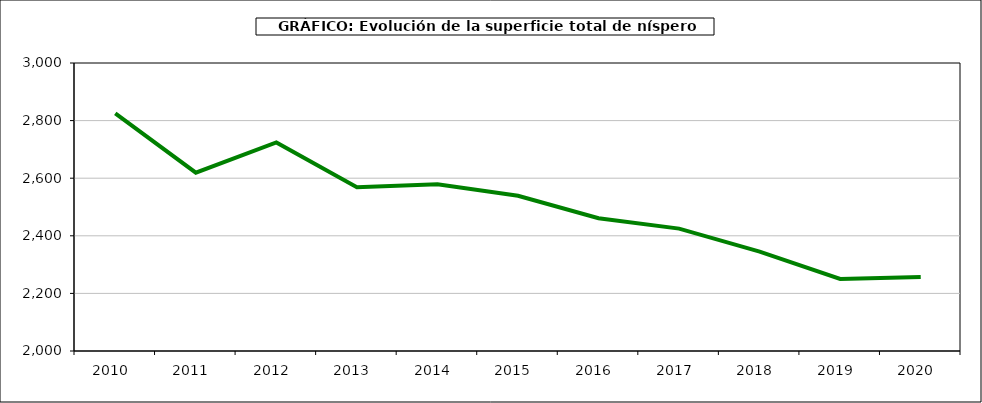
| Category | superficie níspero |
|---|---|
| 2010.0 | 2825 |
| 2011.0 | 2619 |
| 2012.0 | 2724 |
| 2013.0 | 2569 |
| 2014.0 | 2579 |
| 2015.0 | 2539 |
| 2016.0 | 2461 |
| 2017.0 | 2425 |
| 2018.0 | 2345 |
| 2019.0 | 2250 |
| 2020.0 | 2257 |